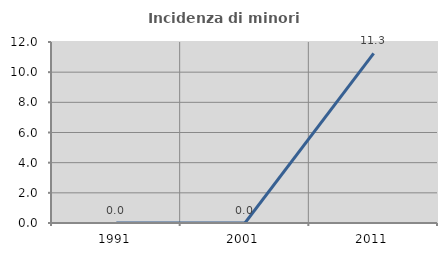
| Category | Incidenza di minori stranieri |
|---|---|
| 1991.0 | 0 |
| 2001.0 | 0 |
| 2011.0 | 11.25 |